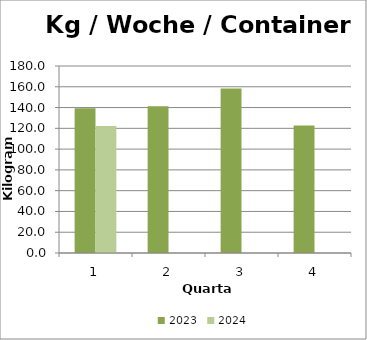
| Category | 2023 | 2024 |
|---|---|---|
| 0 | 139.231 | 122.308 |
| 1 | 141.154 | 0 |
| 2 | 158.462 | 0 |
| 3 | 122.692 | 0 |